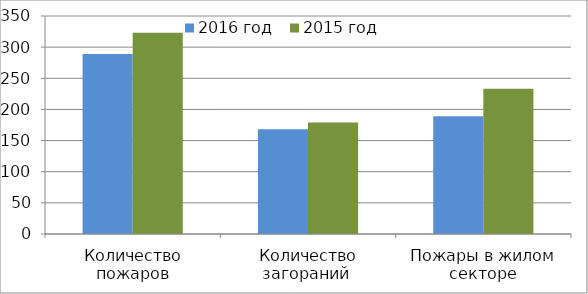
| Category | 2016 год | 2015 год |
|---|---|---|
| Количество пожаров | 289 | 323 |
| Количество загораний  | 168 | 179 |
| Пожары в жилом секторе | 189 | 233 |